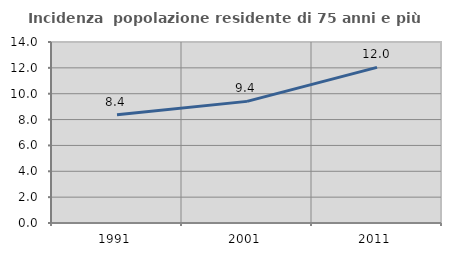
| Category | Incidenza  popolazione residente di 75 anni e più |
|---|---|
| 1991.0 | 8.382 |
| 2001.0 | 9.407 |
| 2011.0 | 12.035 |